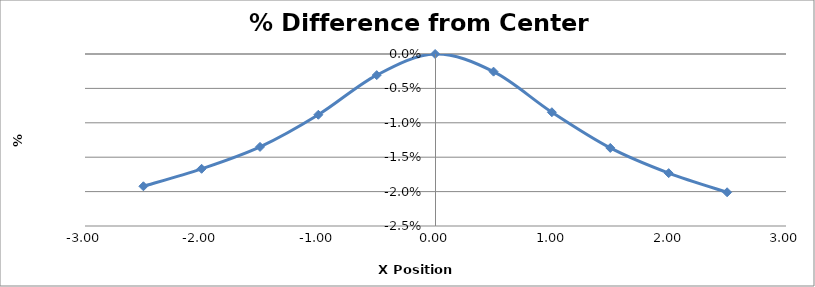
| Category | Series 0 |
|---|---|
| -2.5 | -0.019 |
| -2.002 | -0.017 |
| -1.5019999999999998 | -0.014 |
| -1.0030000000000001 | -0.009 |
| -0.5030000000000001 | -0.003 |
| -0.0030000000000001137 | 0 |
| 0.4969999999999999 | -0.003 |
| 0.9959999999999996 | -0.008 |
| 1.4959999999999996 | -0.014 |
| 1.9959999999999996 | -0.017 |
| 2.4959999999999996 | -0.02 |